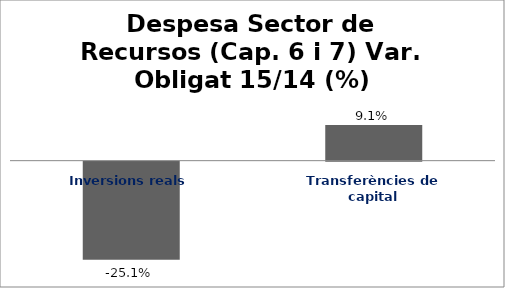
| Category | Series 0 |
|---|---|
| Inversions reals | -0.251 |
| Transferències de capital | 0.091 |